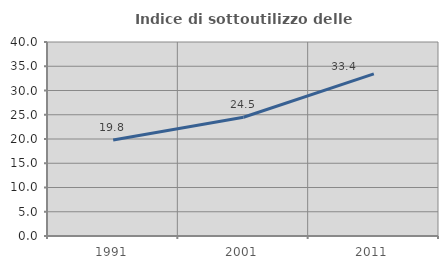
| Category | Indice di sottoutilizzo delle abitazioni  |
|---|---|
| 1991.0 | 19.786 |
| 2001.0 | 24.492 |
| 2011.0 | 33.429 |